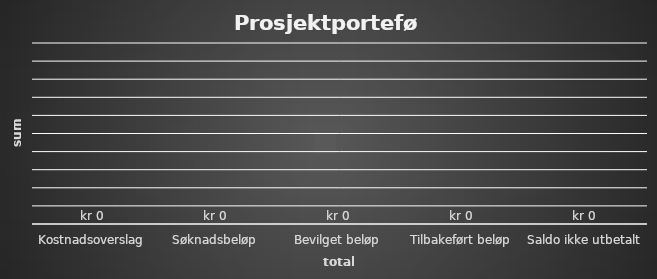
| Category | Series 0 |
|---|---|
| Kostnadsoverslag | 0 |
| Søknadsbeløp | 0 |
| Bevilget beløp | 0 |
| Tilbakeført beløp | 0 |
| Saldo ikke utbetalt | 0 |